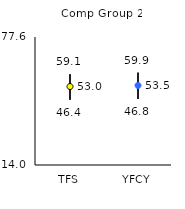
| Category | 25th | 75th | Mean |
|---|---|---|---|
| TFS | 46.4 | 59.1 | 52.98 |
| YFCY | 46.8 | 59.9 | 53.51 |